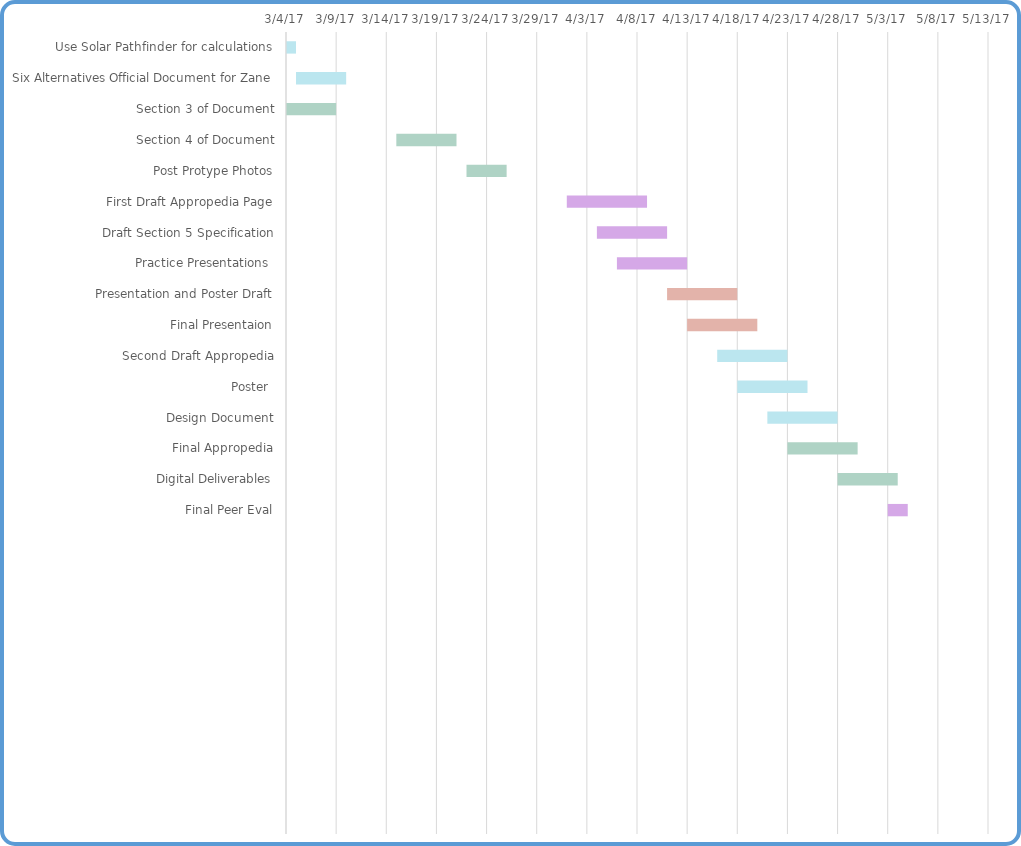
| Category | Start Date | Days Complete | Days Remain |
|---|---|---|---|
| Use Solar Pathfinder for calculations | 3/4/17 | 0.01 | 0.99 |
| Six Alternatives Official Document for Zane | 3/5/17 | 0 | 5 |
| Section 3 of Document | 3/4/17 | 0 | 5 |
| Section 4 of Document | 3/15/17 | 0 | 6 |
| Post Protype Photos | 3/22/17 | 0 | 4 |
| First Draft Appropedia Page | 4/1/17 | 0 | 8 |
| Draft Section 5 Specification | 4/4/17 | 0 | 7 |
| Practice Presentations  | 4/6/17 | 0 | 7 |
| Presentation and Poster Draft | 4/11/17 | 0 | 7 |
| Final Presentaion | 4/13/17 | 0 | 7 |
| Second Draft Appropedia | 4/16/17 | 0 | 7 |
| Poster  | 4/18/17 | 0 | 7 |
| Design Document | 4/21/17 | 0 | 7 |
| Final Appropedia | 4/23/17 | 0 | 7 |
| Digital Deliverables | 4/28/17 | 0 | 6 |
| Final Peer Eval | 5/3/17 | 0 | 2 |